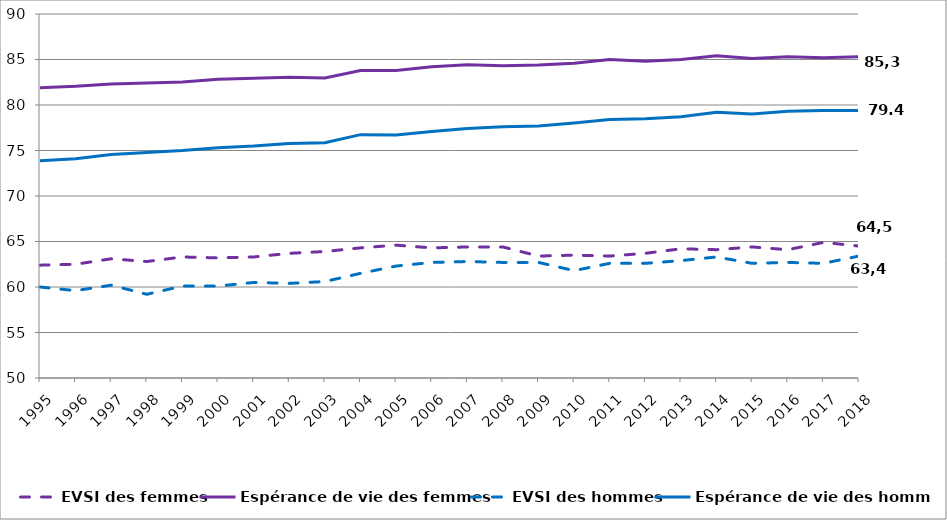
| Category | EVSI des femmes | Espérance de vie des femmes | EVSI des hommes | Espérance de vie des hommes |
|---|---|---|---|---|
| 1995.0 | 62.4 | 81.896 | 60 | 73.869 |
| 1996.0 | 62.5 | 82.056 | 59.6 | 74.102 |
| 1997.0 | 63.1 | 82.316 | 60.2 | 74.551 |
| 1998.0 | 62.8 | 82.422 | 59.2 | 74.775 |
| 1999.0 | 63.3 | 82.525 | 60.1 | 74.995 |
| 2000.0 | 63.2 | 82.822 | 60.1 | 75.304 |
| 2001.0 | 63.3 | 82.948 | 60.5 | 75.485 |
| 2002.0 | 63.7 | 83.054 | 60.4 | 75.765 |
| 2003.0 | 63.9 | 82.962 | 60.6 | 75.861 |
| 2004.0 | 64.3 | 83.8 | 61.5 | 76.742 |
| 2005.0 | 64.6 | 83.8 | 62.3 | 76.7 |
| 2006.0 | 64.3 | 84.215 | 62.7 | 77.1 |
| 2007.0 | 64.4 | 84.413 | 62.8 | 77.427 |
| 2008.0 | 64.4 | 84.3 | 62.7 | 77.6 |
| 2009.0 | 63.4 | 84.4 | 62.7 | 77.7 |
| 2010.0 | 63.5 | 84.6 | 61.8 | 78.027 |
| 2011.0 | 63.4 | 85 | 62.6 | 78.4 |
| 2012.0 | 63.7 | 84.8 | 62.6 | 78.5 |
| 2013.0 | 64.2 | 85 | 62.9 | 78.7 |
| 2014.0 | 64.1 | 85.4 | 63.3 | 79.2 |
| 2015.0 | 64.4 | 85.1 | 62.6 | 79 |
| 2016.0 | 64.1 | 85.3 | 62.7 | 79.3 |
| 2017.0 | 64.9 | 85.2 | 62.6 | 79.4 |
| 2018.0 | 64.5 | 85.3 | 63.4 | 79.4 |